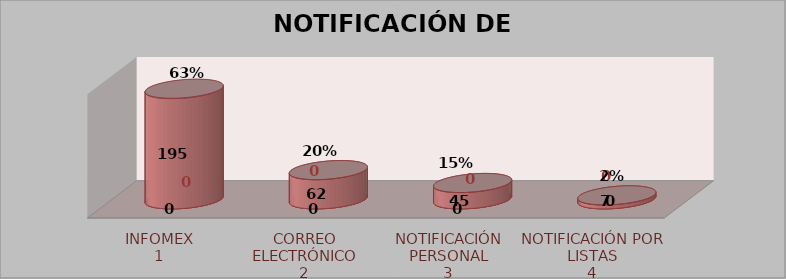
| Category | Series 0 | Series 1 | Series 2 | Series 3 |
|---|---|---|---|---|
| 0 |  |  | 223 | 0.69 |
| 1 |  |  | 59 | 0.183 |
| 2 |  |  | 33 | 0.102 |
| 3 |  |  | 8 | 0.025 |